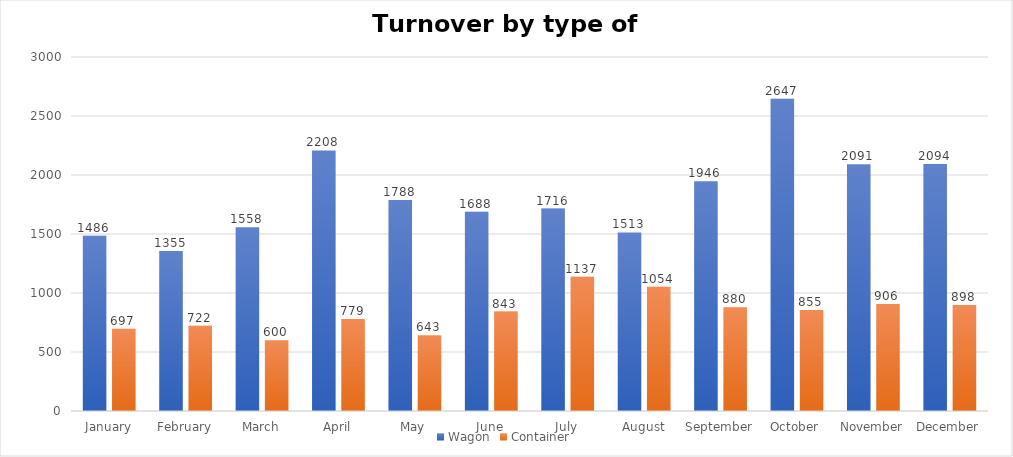
| Category | Wagon | Container |
|---|---|---|
| January | 1486 | 697 |
| February | 1355 | 722 |
| March | 1558 | 600 |
| April | 2208 | 779 |
| May | 1788 | 643 |
| June | 1688 | 843 |
| July | 1716 | 1137 |
| August | 1513 | 1054 |
| September | 1946 | 880 |
| October | 2647 | 855 |
| November | 2091 | 906 |
| December | 2094 | 898 |